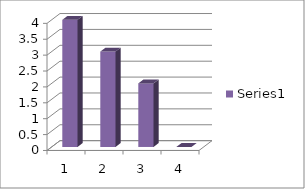
| Category | Series 0 |
|---|---|
| 0 | 4 |
| 1 | 3 |
| 2 | 2 |
| 3 | 0 |